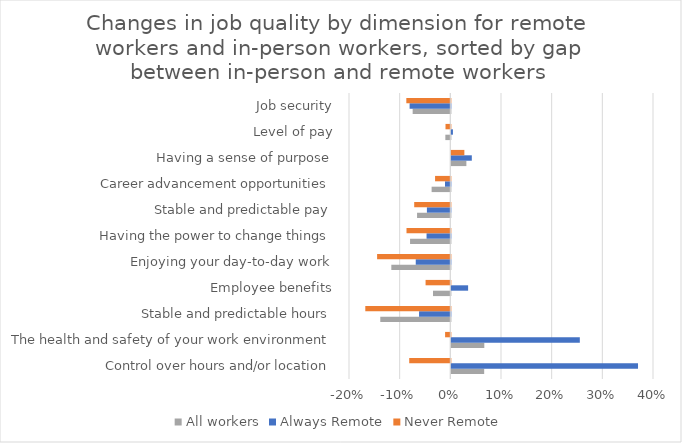
| Category | All workers | Always Remote | Never Remote |
|---|---|---|---|
| Control over hours and/or location | 0.065 | 0.368 | -0.081 |
| The health and safety of your work environment | 0.065 | 0.254 | -0.01 |
| Stable and predictable hours | -0.138 | -0.062 | -0.168 |
| Employee benefits | -0.034 | 0.033 | -0.049 |
| Enjoying your day-to-day work | -0.116 | -0.068 | -0.145 |
| Having the power to change things | -0.079 | -0.047 | -0.087 |
| Stable and predictable pay | -0.066 | -0.046 | -0.071 |
| Career advancement opportunities | -0.037 | -0.011 | -0.03 |
| Having a sense of purpose | 0.03 | 0.04 | 0.026 |
| Level of pay | -0.01 | 0.003 | -0.01 |
| Job security | -0.074 | -0.08 | -0.087 |